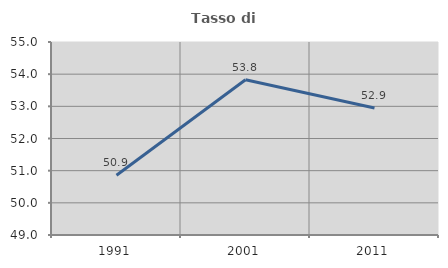
| Category | Tasso di occupazione   |
|---|---|
| 1991.0 | 50.86 |
| 2001.0 | 53.826 |
| 2011.0 | 52.947 |